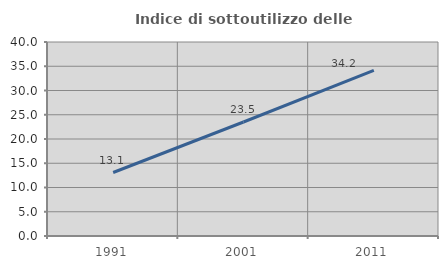
| Category | Indice di sottoutilizzo delle abitazioni  |
|---|---|
| 1991.0 | 13.091 |
| 2001.0 | 23.507 |
| 2011.0 | 34.164 |